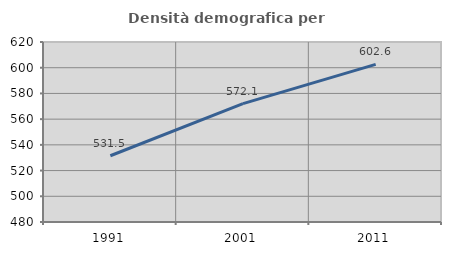
| Category | Densità demografica |
|---|---|
| 1991.0 | 531.534 |
| 2001.0 | 572.095 |
| 2011.0 | 602.636 |